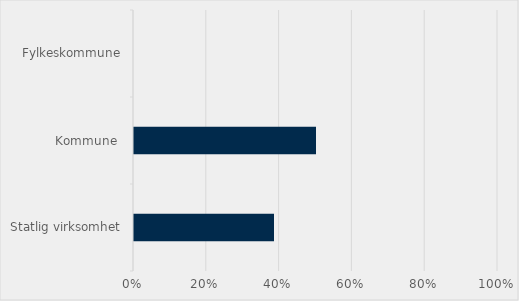
| Category | Prosent |
|---|---|
| Statlig virksomhet | 0.385 |
| Kommune  | 0.5 |
| Fylkeskommune | 0 |